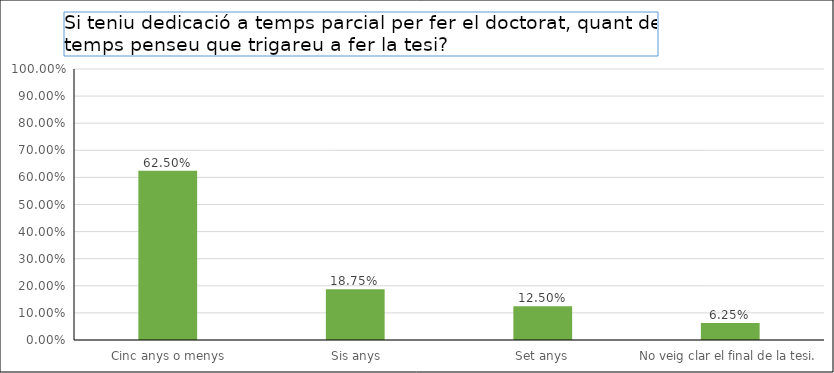
| Category | Series 0 |
|---|---|
|  Cinc anys o menys | 0.625 |
|  Sis anys | 0.188 |
| Set anys | 0.125 |
| No veig clar el final de la tesi. | 0.062 |